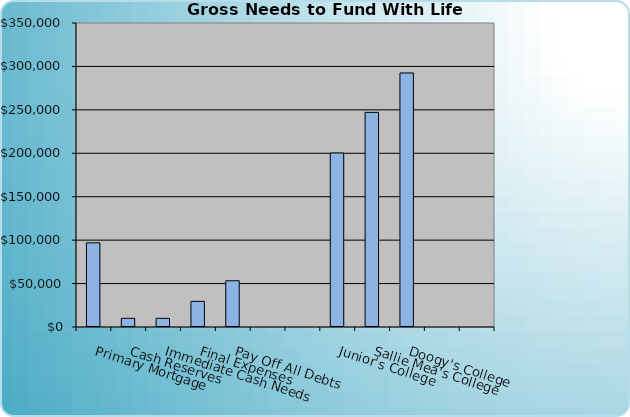
| Category | Series 0 |
|---|---|
| Primary Mortgage | 96905.178 |
| Cash Reserves | 10000 |
| Immediate Cash Needs | 10000 |
| Final Expenses | 29500 |
| Pay Off All Debts | 53228.929 |
|   | 0 |
|   | 0 |
| Junior's College | 200362.394 |
| Sallie Mea's College | 247104.059 |
| Doogy's College | 292482.725 |
|   | 0 |
|   | 0 |